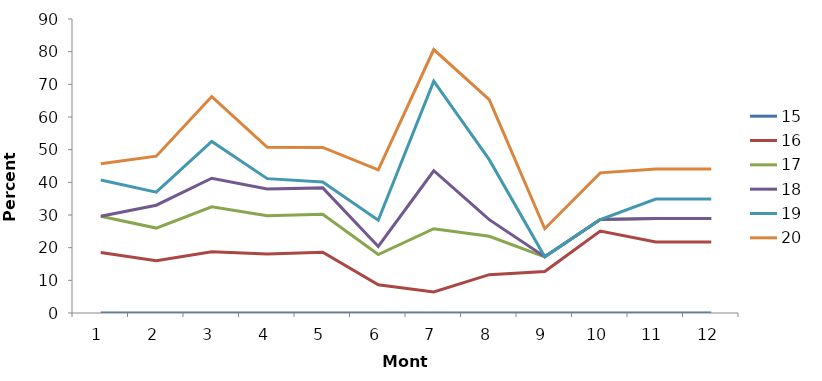
| Category | 15 | 16 | 17 | 18 | 19 | 20 |
|---|---|---|---|---|---|---|
| 1.0 | 0 | 18.519 | 29.63 | 29.63 | 40.741 | 45.679 |
| 2.0 | 0 | 16 | 26 | 33 | 37 | 48 |
| 3.0 | 0 | 18.75 | 32.5 | 41.25 | 52.5 | 66.25 |
| 4.0 | 0 | 18.085 | 29.787 | 37.943 | 41.135 | 50.709 |
| 5.0 | 0 | 18.6 | 30.2 | 38.3 | 40.1 | 50.7 |
| 6.0 | 0 | 8.642 | 17.901 | 20.37 | 28.395 | 43.827 |
| 7.0 | 0 | 6.452 | 25.806 | 43.548 | 70.968 | 80.645 |
| 8.0 | 0 | 11.735 | 23.469 | 28.571 | 46.939 | 65.306 |
| 9.0 | 0 | 12.7 | 17.2 | 17.2 | 17.2 | 25.8 |
| 10.0 | 0 | 25.1 | 28.6 | 28.6 | 28.6 | 42.9 |
| 11.0 | 0 | 21.711 | 28.947 | 28.947 | 34.868 | 44.079 |
| 12.0 | 0 | 21.711 | 28.947 | 28.947 | 34.868 | 44.079 |